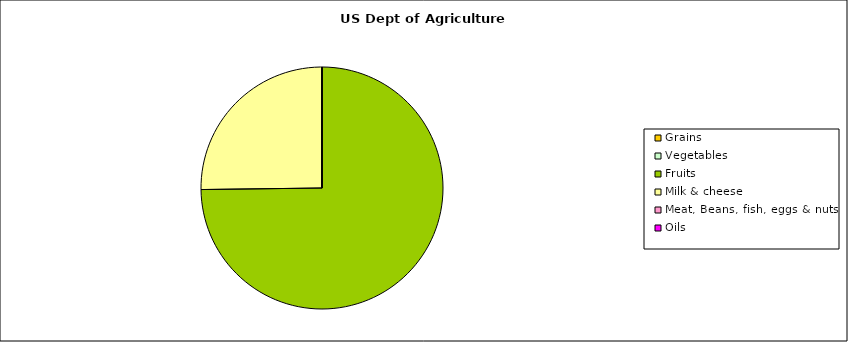
| Category | Series 0 |
|---|---|
| Grains | 0 |
| Vegetables | 0 |
| Fruits | 89 |
| Milk & cheese | 30 |
| Meat, Beans, fish, eggs & nuts  | 0 |
| Oils | 0 |